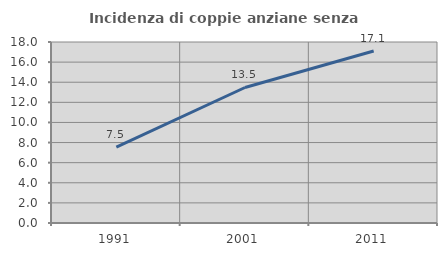
| Category | Incidenza di coppie anziane senza figli  |
|---|---|
| 1991.0 | 7.54 |
| 2001.0 | 13.477 |
| 2011.0 | 17.103 |